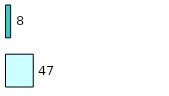
| Category | Series 0 | Series 1 |
|---|---|---|
| 0 | 47 | 8 |